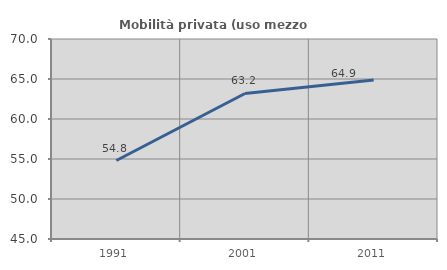
| Category | Mobilità privata (uso mezzo privato) |
|---|---|
| 1991.0 | 54.812 |
| 2001.0 | 63.19 |
| 2011.0 | 64.873 |